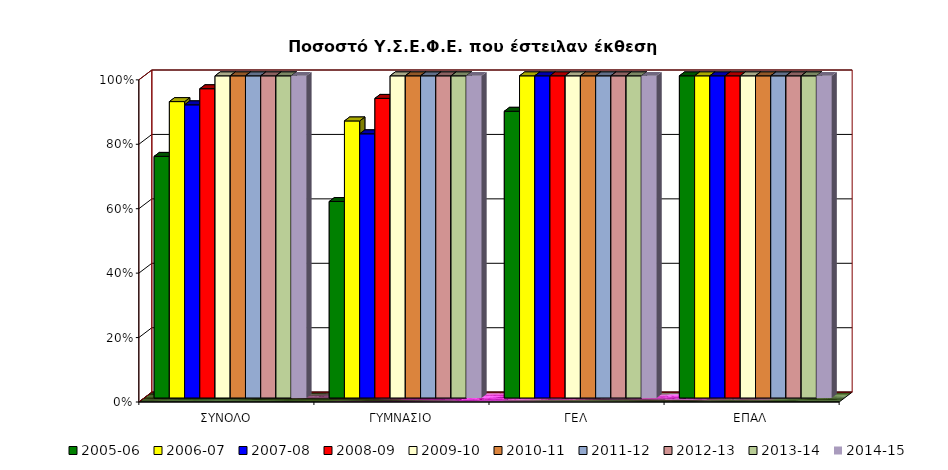
| Category | 2005-06 | 2006-07 | 2007-08 | 2008-09 | 2009-10 | 2010-11 | 2011-12 | 2012-13 | 2013-14 | 2014-15 |
|---|---|---|---|---|---|---|---|---|---|---|
| ΣΥΝΟΛΟ | 0.75 | 0.92 | 0.91 | 0.96 | 1 | 1 | 1 | 1 | 1 | 1 |
| ΓΥΜΝΑΣΙΟ | 0.61 | 0.86 | 0.82 | 0.93 | 1 | 1 | 1 | 1 | 1 | 1 |
| ΓΕΛ | 0.89 | 1 | 1 | 1 | 1 | 1 | 1 | 1 | 1 | 1 |
| ΕΠΑΛ | 1 | 1 | 1 | 1 | 1 | 1 | 1 | 1 | 1 | 1 |